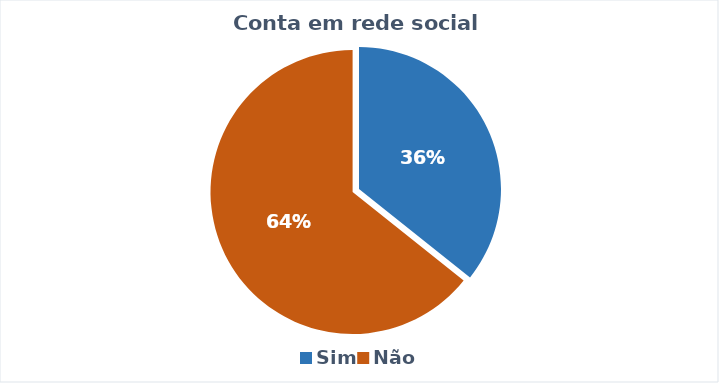
| Category | Series 0 |
|---|---|
| Sim | 5 |
| Não | 9 |